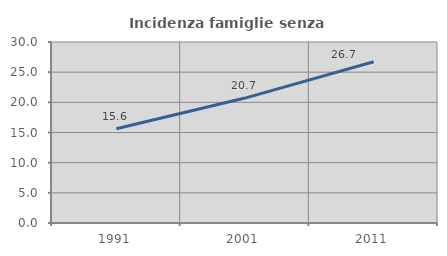
| Category | Incidenza famiglie senza nuclei |
|---|---|
| 1991.0 | 15.614 |
| 2001.0 | 20.707 |
| 2011.0 | 26.729 |